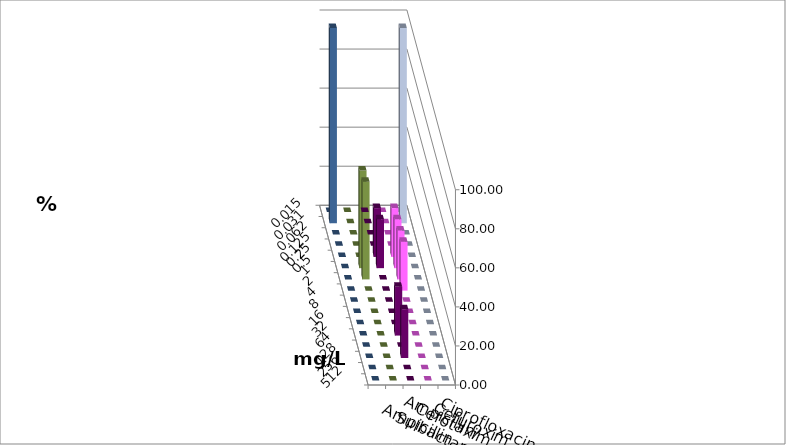
| Category | Ampicillin | Ampicillin/ Sulbactam | Cefotaxim | Cefuroxim | Ciprofloxacin |
|---|---|---|---|---|---|
| 0.015 | 0 | 0 | 0 | 0 | 0 |
| 0.031 | 0 | 0 | 100 | 0 | 100 |
| 0.062 | 0 | 0 | 0 | 0 | 0 |
| 0.125 | 0 | 0 | 0 | 0 | 0 |
| 0.25 | 25 | 25 | 0 | 0 | 0 |
| 0.5 | 25 | 25 | 0 | 50 | 0 |
| 1.0 | 0 | 25 | 0 | 50 | 0 |
| 2.0 | 0 | 25 | 0 | 0 | 0 |
| 4.0 | 0 | 0 | 0 | 0 | 0 |
| 8.0 | 0 | 0 | 0 | 0 | 0 |
| 16.0 | 0 | 0 | 0 | 0 | 0 |
| 32.0 | 25 | 0 | 0 | 0 | 0 |
| 64.0 | 0 | 0 | 0 | 0 | 0 |
| 128.0 | 25 | 0 | 0 | 0 | 0 |
| 256.0 | 0 | 0 | 0 | 0 | 0 |
| 512.0 | 0 | 0 | 0 | 0 | 0 |